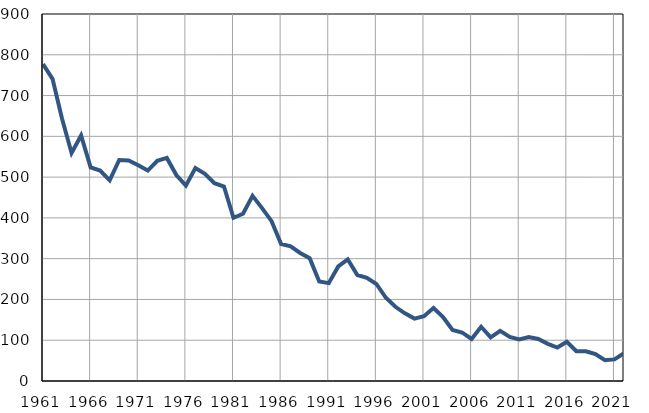
| Category | Infants
deaths |
|---|---|
| 1961.0 | 777 |
| 1962.0 | 741 |
| 1963.0 | 643 |
| 1964.0 | 559 |
| 1965.0 | 602 |
| 1966.0 | 524 |
| 1967.0 | 516 |
| 1968.0 | 492 |
| 1969.0 | 542 |
| 1970.0 | 541 |
| 1971.0 | 529 |
| 1972.0 | 516 |
| 1973.0 | 540 |
| 1974.0 | 547 |
| 1975.0 | 505 |
| 1976.0 | 479 |
| 1977.0 | 522 |
| 1978.0 | 508 |
| 1979.0 | 485 |
| 1980.0 | 477 |
| 1981.0 | 400 |
| 1982.0 | 410 |
| 1983.0 | 454 |
| 1984.0 | 424 |
| 1985.0 | 392 |
| 1986.0 | 336 |
| 1987.0 | 330 |
| 1988.0 | 314 |
| 1989.0 | 301 |
| 1990.0 | 244 |
| 1991.0 | 240 |
| 1992.0 | 281 |
| 1993.0 | 298 |
| 1994.0 | 260 |
| 1995.0 | 253 |
| 1996.0 | 238 |
| 1997.0 | 204 |
| 1998.0 | 182 |
| 1999.0 | 166 |
| 2000.0 | 153 |
| 2001.0 | 159 |
| 2002.0 | 179 |
| 2003.0 | 157 |
| 2004.0 | 125 |
| 2005.0 | 119 |
| 2006.0 | 103 |
| 2007.0 | 133 |
| 2008.0 | 107 |
| 2009.0 | 123 |
| 2010.0 | 108 |
| 2011.0 | 102 |
| 2012.0 | 108 |
| 2013.0 | 103 |
| 2014.0 | 91 |
| 2015.0 | 82 |
| 2016.0 | 96 |
| 2017.0 | 73 |
| 2018.0 | 73 |
| 2019.0 | 66 |
| 2020.0 | 51 |
| 2021.0 | 53 |
| 2022.0 | 68 |